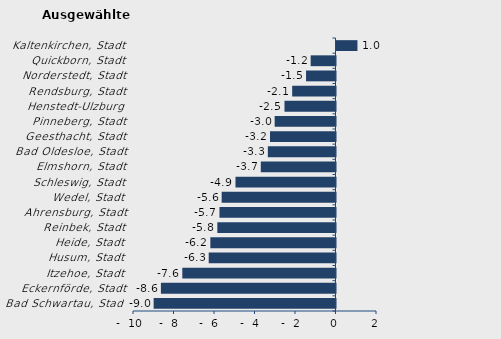
| Category | Überschuss der Geborenen (+) bzw. Gestorbenen (-) |
|---|---|
| Bad Schwartau, Stadt | -8.981 |
| Eckernförde, Stadt | -8.622 |
| Itzehoe, Stadt | -7.566 |
| Husum, Stadt | -6.261 |
| Heide, Stadt | -6.18 |
| Reinbek, Stadt | -5.835 |
| Ahrensburg, Stadt | -5.731 |
| Wedel, Stadt | -5.622 |
| Schleswig, Stadt | -4.939 |
| Elmshorn, Stadt | -3.69 |
| Bad Oldesloe, Stadt | -3.341 |
| Geesthacht, Stadt | -3.234 |
| Pinneberg, Stadt | -3.004 |
| Henstedt-Ulzburg | -2.519 |
| Rendsburg, Stadt | -2.14 |
| Norderstedt, Stadt | -1.455 |
| Quickborn, Stadt | -1.226 |
| Kaltenkirchen, Stadt | 1.035 |